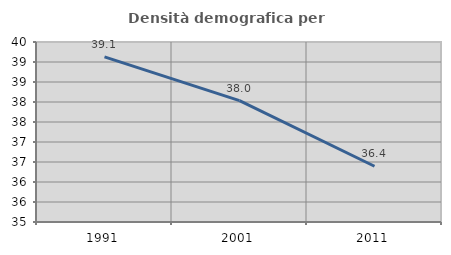
| Category | Densità demografica |
|---|---|
| 1991.0 | 39.128 |
| 2001.0 | 38.033 |
| 2011.0 | 36.394 |